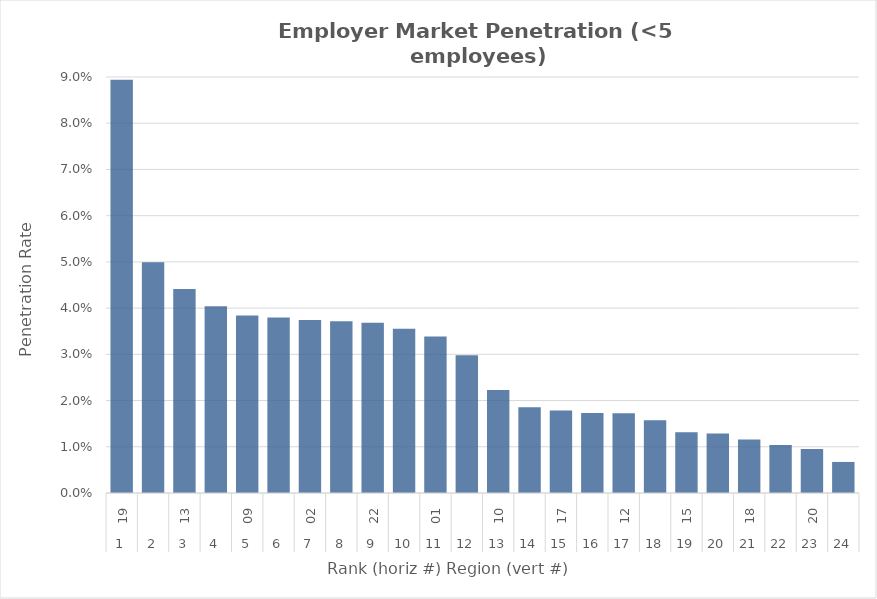
| Category | Rate |
|---|---|
| 0 | 0.089 |
| 1 | 0.05 |
| 2 | 0.044 |
| 3 | 0.04 |
| 4 | 0.038 |
| 5 | 0.038 |
| 6 | 0.037 |
| 7 | 0.037 |
| 8 | 0.037 |
| 9 | 0.036 |
| 10 | 0.034 |
| 11 | 0.03 |
| 12 | 0.022 |
| 13 | 0.019 |
| 14 | 0.018 |
| 15 | 0.017 |
| 16 | 0.017 |
| 17 | 0.016 |
| 18 | 0.013 |
| 19 | 0.013 |
| 20 | 0.012 |
| 21 | 0.01 |
| 22 | 0.01 |
| 23 | 0.007 |